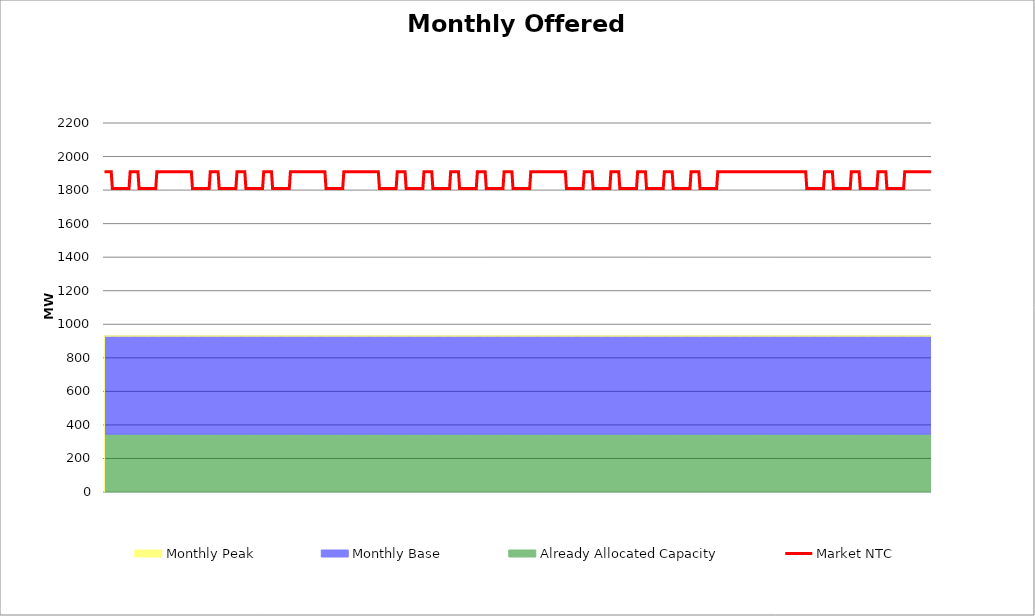
| Category | Market NTC |
|---|---|
| 0 | 1910 |
| 1 | 1910 |
| 2 | 1910 |
| 3 | 1910 |
| 4 | 1910 |
| 5 | 1910 |
| 6 | 1910 |
| 7 | 1810 |
| 8 | 1810 |
| 9 | 1810 |
| 10 | 1810 |
| 11 | 1810 |
| 12 | 1810 |
| 13 | 1810 |
| 14 | 1810 |
| 15 | 1810 |
| 16 | 1810 |
| 17 | 1810 |
| 18 | 1810 |
| 19 | 1810 |
| 20 | 1810 |
| 21 | 1810 |
| 22 | 1810 |
| 23 | 1910 |
| 24 | 1910 |
| 25 | 1910 |
| 26 | 1910 |
| 27 | 1910 |
| 28 | 1910 |
| 29 | 1910 |
| 30 | 1910 |
| 31 | 1810 |
| 32 | 1810 |
| 33 | 1810 |
| 34 | 1810 |
| 35 | 1810 |
| 36 | 1810 |
| 37 | 1810 |
| 38 | 1810 |
| 39 | 1810 |
| 40 | 1810 |
| 41 | 1810 |
| 42 | 1810 |
| 43 | 1810 |
| 44 | 1810 |
| 45 | 1810 |
| 46 | 1810 |
| 47 | 1910 |
| 48 | 1910 |
| 49 | 1910 |
| 50 | 1910 |
| 51 | 1910 |
| 52 | 1910 |
| 53 | 1910 |
| 54 | 1910 |
| 55 | 1910 |
| 56 | 1910 |
| 57 | 1910 |
| 58 | 1910 |
| 59 | 1910 |
| 60 | 1910 |
| 61 | 1910 |
| 62 | 1910 |
| 63 | 1910 |
| 64 | 1910 |
| 65 | 1910 |
| 66 | 1910 |
| 67 | 1910 |
| 68 | 1910 |
| 69 | 1910 |
| 70 | 1910 |
| 71 | 1910 |
| 72 | 1910 |
| 73 | 1910 |
| 74 | 1910 |
| 75 | 1910 |
| 76 | 1910 |
| 77 | 1910 |
| 78 | 1910 |
| 79 | 1810 |
| 80 | 1810 |
| 81 | 1810 |
| 82 | 1810 |
| 83 | 1810 |
| 84 | 1810 |
| 85 | 1810 |
| 86 | 1810 |
| 87 | 1810 |
| 88 | 1810 |
| 89 | 1810 |
| 90 | 1810 |
| 91 | 1810 |
| 92 | 1810 |
| 93 | 1810 |
| 94 | 1810 |
| 95 | 1910 |
| 96 | 1910 |
| 97 | 1910 |
| 98 | 1910 |
| 99 | 1910 |
| 100 | 1910 |
| 101 | 1910 |
| 102 | 1910 |
| 103 | 1810 |
| 104 | 1810 |
| 105 | 1810 |
| 106 | 1810 |
| 107 | 1810 |
| 108 | 1810 |
| 109 | 1810 |
| 110 | 1810 |
| 111 | 1810 |
| 112 | 1810 |
| 113 | 1810 |
| 114 | 1810 |
| 115 | 1810 |
| 116 | 1810 |
| 117 | 1810 |
| 118 | 1810 |
| 119 | 1910 |
| 120 | 1910 |
| 121 | 1910 |
| 122 | 1910 |
| 123 | 1910 |
| 124 | 1910 |
| 125 | 1910 |
| 126 | 1910 |
| 127 | 1810 |
| 128 | 1810 |
| 129 | 1810 |
| 130 | 1810 |
| 131 | 1810 |
| 132 | 1810 |
| 133 | 1810 |
| 134 | 1810 |
| 135 | 1810 |
| 136 | 1810 |
| 137 | 1810 |
| 138 | 1810 |
| 139 | 1810 |
| 140 | 1810 |
| 141 | 1810 |
| 142 | 1810 |
| 143 | 1910 |
| 144 | 1910 |
| 145 | 1910 |
| 146 | 1910 |
| 147 | 1910 |
| 148 | 1910 |
| 149 | 1910 |
| 150 | 1910 |
| 151 | 1810 |
| 152 | 1810 |
| 153 | 1810 |
| 154 | 1810 |
| 155 | 1810 |
| 156 | 1810 |
| 157 | 1810 |
| 158 | 1810 |
| 159 | 1810 |
| 160 | 1810 |
| 161 | 1810 |
| 162 | 1810 |
| 163 | 1810 |
| 164 | 1810 |
| 165 | 1810 |
| 166 | 1810 |
| 167 | 1910 |
| 168 | 1910 |
| 169 | 1910 |
| 170 | 1910 |
| 171 | 1910 |
| 172 | 1910 |
| 173 | 1910 |
| 174 | 1910 |
| 175 | 1910 |
| 176 | 1910 |
| 177 | 1910 |
| 178 | 1910 |
| 179 | 1910 |
| 180 | 1910 |
| 181 | 1910 |
| 182 | 1910 |
| 183 | 1910 |
| 184 | 1910 |
| 185 | 1910 |
| 186 | 1910 |
| 187 | 1910 |
| 188 | 1910 |
| 189 | 1910 |
| 190 | 1910 |
| 191 | 1910 |
| 192 | 1910 |
| 193 | 1910 |
| 194 | 1910 |
| 195 | 1910 |
| 196 | 1910 |
| 197 | 1910 |
| 198 | 1910 |
| 199 | 1810 |
| 200 | 1810 |
| 201 | 1810 |
| 202 | 1810 |
| 203 | 1810 |
| 204 | 1810 |
| 205 | 1810 |
| 206 | 1810 |
| 207 | 1810 |
| 208 | 1810 |
| 209 | 1810 |
| 210 | 1810 |
| 211 | 1810 |
| 212 | 1810 |
| 213 | 1810 |
| 214 | 1810 |
| 215 | 1910 |
| 216 | 1910 |
| 217 | 1910 |
| 218 | 1910 |
| 219 | 1910 |
| 220 | 1910 |
| 221 | 1910 |
| 222 | 1910 |
| 223 | 1910 |
| 224 | 1910 |
| 225 | 1910 |
| 226 | 1910 |
| 227 | 1910 |
| 228 | 1910 |
| 229 | 1910 |
| 230 | 1910 |
| 231 | 1910 |
| 232 | 1910 |
| 233 | 1910 |
| 234 | 1910 |
| 235 | 1910 |
| 236 | 1910 |
| 237 | 1910 |
| 238 | 1910 |
| 239 | 1910 |
| 240 | 1910 |
| 241 | 1910 |
| 242 | 1910 |
| 243 | 1910 |
| 244 | 1910 |
| 245 | 1910 |
| 246 | 1910 |
| 247 | 1810 |
| 248 | 1810 |
| 249 | 1810 |
| 250 | 1810 |
| 251 | 1810 |
| 252 | 1810 |
| 253 | 1810 |
| 254 | 1810 |
| 255 | 1810 |
| 256 | 1810 |
| 257 | 1810 |
| 258 | 1810 |
| 259 | 1810 |
| 260 | 1810 |
| 261 | 1810 |
| 262 | 1810 |
| 263 | 1910 |
| 264 | 1910 |
| 265 | 1910 |
| 266 | 1910 |
| 267 | 1910 |
| 268 | 1910 |
| 269 | 1910 |
| 270 | 1910 |
| 271 | 1810 |
| 272 | 1810 |
| 273 | 1810 |
| 274 | 1810 |
| 275 | 1810 |
| 276 | 1810 |
| 277 | 1810 |
| 278 | 1810 |
| 279 | 1810 |
| 280 | 1810 |
| 281 | 1810 |
| 282 | 1810 |
| 283 | 1810 |
| 284 | 1810 |
| 285 | 1810 |
| 286 | 1810 |
| 287 | 1910 |
| 288 | 1910 |
| 289 | 1910 |
| 290 | 1910 |
| 291 | 1910 |
| 292 | 1910 |
| 293 | 1910 |
| 294 | 1910 |
| 295 | 1810 |
| 296 | 1810 |
| 297 | 1810 |
| 298 | 1810 |
| 299 | 1810 |
| 300 | 1810 |
| 301 | 1810 |
| 302 | 1810 |
| 303 | 1810 |
| 304 | 1810 |
| 305 | 1810 |
| 306 | 1810 |
| 307 | 1810 |
| 308 | 1810 |
| 309 | 1810 |
| 310 | 1810 |
| 311 | 1910 |
| 312 | 1910 |
| 313 | 1910 |
| 314 | 1910 |
| 315 | 1910 |
| 316 | 1910 |
| 317 | 1910 |
| 318 | 1910 |
| 319 | 1810 |
| 320 | 1810 |
| 321 | 1810 |
| 322 | 1810 |
| 323 | 1810 |
| 324 | 1810 |
| 325 | 1810 |
| 326 | 1810 |
| 327 | 1810 |
| 328 | 1810 |
| 329 | 1810 |
| 330 | 1810 |
| 331 | 1810 |
| 332 | 1810 |
| 333 | 1810 |
| 334 | 1810 |
| 335 | 1910 |
| 336 | 1910 |
| 337 | 1910 |
| 338 | 1910 |
| 339 | 1910 |
| 340 | 1910 |
| 341 | 1910 |
| 342 | 1910 |
| 343 | 1810 |
| 344 | 1810 |
| 345 | 1810 |
| 346 | 1810 |
| 347 | 1810 |
| 348 | 1810 |
| 349 | 1810 |
| 350 | 1810 |
| 351 | 1810 |
| 352 | 1810 |
| 353 | 1810 |
| 354 | 1810 |
| 355 | 1810 |
| 356 | 1810 |
| 357 | 1810 |
| 358 | 1810 |
| 359 | 1910 |
| 360 | 1910 |
| 361 | 1910 |
| 362 | 1910 |
| 363 | 1910 |
| 364 | 1910 |
| 365 | 1910 |
| 366 | 1910 |
| 367 | 1810 |
| 368 | 1810 |
| 369 | 1810 |
| 370 | 1810 |
| 371 | 1810 |
| 372 | 1810 |
| 373 | 1810 |
| 374 | 1810 |
| 375 | 1810 |
| 376 | 1810 |
| 377 | 1810 |
| 378 | 1810 |
| 379 | 1810 |
| 380 | 1810 |
| 381 | 1810 |
| 382 | 1810 |
| 383 | 1910 |
| 384 | 1910 |
| 385 | 1910 |
| 386 | 1910 |
| 387 | 1910 |
| 388 | 1910 |
| 389 | 1910 |
| 390 | 1910 |
| 391 | 1910 |
| 392 | 1910 |
| 393 | 1910 |
| 394 | 1910 |
| 395 | 1910 |
| 396 | 1910 |
| 397 | 1910 |
| 398 | 1910 |
| 399 | 1910 |
| 400 | 1910 |
| 401 | 1910 |
| 402 | 1910 |
| 403 | 1910 |
| 404 | 1910 |
| 405 | 1910 |
| 406 | 1910 |
| 407 | 1910 |
| 408 | 1910 |
| 409 | 1910 |
| 410 | 1910 |
| 411 | 1910 |
| 412 | 1910 |
| 413 | 1910 |
| 414 | 1910 |
| 415 | 1810 |
| 416 | 1810 |
| 417 | 1810 |
| 418 | 1810 |
| 419 | 1810 |
| 420 | 1810 |
| 421 | 1810 |
| 422 | 1810 |
| 423 | 1810 |
| 424 | 1810 |
| 425 | 1810 |
| 426 | 1810 |
| 427 | 1810 |
| 428 | 1810 |
| 429 | 1810 |
| 430 | 1810 |
| 431 | 1910 |
| 432 | 1910 |
| 433 | 1910 |
| 434 | 1910 |
| 435 | 1910 |
| 436 | 1910 |
| 437 | 1910 |
| 438 | 1910 |
| 439 | 1810 |
| 440 | 1810 |
| 441 | 1810 |
| 442 | 1810 |
| 443 | 1810 |
| 444 | 1810 |
| 445 | 1810 |
| 446 | 1810 |
| 447 | 1810 |
| 448 | 1810 |
| 449 | 1810 |
| 450 | 1810 |
| 451 | 1810 |
| 452 | 1810 |
| 453 | 1810 |
| 454 | 1810 |
| 455 | 1910 |
| 456 | 1910 |
| 457 | 1910 |
| 458 | 1910 |
| 459 | 1910 |
| 460 | 1910 |
| 461 | 1910 |
| 462 | 1910 |
| 463 | 1810 |
| 464 | 1810 |
| 465 | 1810 |
| 466 | 1810 |
| 467 | 1810 |
| 468 | 1810 |
| 469 | 1810 |
| 470 | 1810 |
| 471 | 1810 |
| 472 | 1810 |
| 473 | 1810 |
| 474 | 1810 |
| 475 | 1810 |
| 476 | 1810 |
| 477 | 1810 |
| 478 | 1810 |
| 479 | 1910 |
| 480 | 1910 |
| 481 | 1910 |
| 482 | 1910 |
| 483 | 1910 |
| 484 | 1910 |
| 485 | 1910 |
| 486 | 1910 |
| 487 | 1810 |
| 488 | 1810 |
| 489 | 1810 |
| 490 | 1810 |
| 491 | 1810 |
| 492 | 1810 |
| 493 | 1810 |
| 494 | 1810 |
| 495 | 1810 |
| 496 | 1810 |
| 497 | 1810 |
| 498 | 1810 |
| 499 | 1810 |
| 500 | 1810 |
| 501 | 1810 |
| 502 | 1810 |
| 503 | 1910 |
| 504 | 1910 |
| 505 | 1910 |
| 506 | 1910 |
| 507 | 1910 |
| 508 | 1910 |
| 509 | 1910 |
| 510 | 1910 |
| 511 | 1810 |
| 512 | 1810 |
| 513 | 1810 |
| 514 | 1810 |
| 515 | 1810 |
| 516 | 1810 |
| 517 | 1810 |
| 518 | 1810 |
| 519 | 1810 |
| 520 | 1810 |
| 521 | 1810 |
| 522 | 1810 |
| 523 | 1810 |
| 524 | 1810 |
| 525 | 1810 |
| 526 | 1810 |
| 527 | 1910 |
| 528 | 1910 |
| 529 | 1910 |
| 530 | 1910 |
| 531 | 1910 |
| 532 | 1910 |
| 533 | 1910 |
| 534 | 1910 |
| 535 | 1810 |
| 536 | 1810 |
| 537 | 1810 |
| 538 | 1810 |
| 539 | 1810 |
| 540 | 1810 |
| 541 | 1810 |
| 542 | 1810 |
| 543 | 1810 |
| 544 | 1810 |
| 545 | 1810 |
| 546 | 1810 |
| 547 | 1810 |
| 548 | 1810 |
| 549 | 1810 |
| 550 | 1810 |
| 551 | 1910 |
| 552 | 1910 |
| 553 | 1910 |
| 554 | 1910 |
| 555 | 1910 |
| 556 | 1910 |
| 557 | 1910 |
| 558 | 1910 |
| 559 | 1910 |
| 560 | 1910 |
| 561 | 1910 |
| 562 | 1910 |
| 563 | 1910 |
| 564 | 1910 |
| 565 | 1910 |
| 566 | 1910 |
| 567 | 1910 |
| 568 | 1910 |
| 569 | 1910 |
| 570 | 1910 |
| 571 | 1910 |
| 572 | 1910 |
| 573 | 1910 |
| 574 | 1910 |
| 575 | 1910 |
| 576 | 1910 |
| 577 | 1910 |
| 578 | 1910 |
| 579 | 1910 |
| 580 | 1910 |
| 581 | 1910 |
| 582 | 1910 |
| 583 | 1910 |
| 584 | 1910 |
| 585 | 1910 |
| 586 | 1910 |
| 587 | 1910 |
| 588 | 1910 |
| 589 | 1910 |
| 590 | 1910 |
| 591 | 1910 |
| 592 | 1910 |
| 593 | 1910 |
| 594 | 1910 |
| 595 | 1910 |
| 596 | 1910 |
| 597 | 1910 |
| 598 | 1910 |
| 599 | 1910 |
| 600 | 1910 |
| 601 | 1910 |
| 602 | 1910 |
| 603 | 1910 |
| 604 | 1910 |
| 605 | 1910 |
| 606 | 1910 |
| 607 | 1910 |
| 608 | 1910 |
| 609 | 1910 |
| 610 | 1910 |
| 611 | 1910 |
| 612 | 1910 |
| 613 | 1910 |
| 614 | 1910 |
| 615 | 1910 |
| 616 | 1910 |
| 617 | 1910 |
| 618 | 1910 |
| 619 | 1910 |
| 620 | 1910 |
| 621 | 1910 |
| 622 | 1910 |
| 623 | 1910 |
| 624 | 1910 |
| 625 | 1910 |
| 626 | 1910 |
| 627 | 1910 |
| 628 | 1910 |
| 629 | 1910 |
| 630 | 1910 |
| 631 | 1810 |
| 632 | 1810 |
| 633 | 1810 |
| 634 | 1810 |
| 635 | 1810 |
| 636 | 1810 |
| 637 | 1810 |
| 638 | 1810 |
| 639 | 1810 |
| 640 | 1810 |
| 641 | 1810 |
| 642 | 1810 |
| 643 | 1810 |
| 644 | 1810 |
| 645 | 1810 |
| 646 | 1810 |
| 647 | 1910 |
| 648 | 1910 |
| 649 | 1910 |
| 650 | 1910 |
| 651 | 1910 |
| 652 | 1910 |
| 653 | 1910 |
| 654 | 1910 |
| 655 | 1810 |
| 656 | 1810 |
| 657 | 1810 |
| 658 | 1810 |
| 659 | 1810 |
| 660 | 1810 |
| 661 | 1810 |
| 662 | 1810 |
| 663 | 1810 |
| 664 | 1810 |
| 665 | 1810 |
| 666 | 1810 |
| 667 | 1810 |
| 668 | 1810 |
| 669 | 1810 |
| 670 | 1810 |
| 671 | 1910 |
| 672 | 1910 |
| 673 | 1910 |
| 674 | 1910 |
| 675 | 1910 |
| 676 | 1910 |
| 677 | 1910 |
| 678 | 1910 |
| 679 | 1810 |
| 680 | 1810 |
| 681 | 1810 |
| 682 | 1810 |
| 683 | 1810 |
| 684 | 1810 |
| 685 | 1810 |
| 686 | 1810 |
| 687 | 1810 |
| 688 | 1810 |
| 689 | 1810 |
| 690 | 1810 |
| 691 | 1810 |
| 692 | 1810 |
| 693 | 1810 |
| 694 | 1810 |
| 695 | 1910 |
| 696 | 1910 |
| 697 | 1910 |
| 698 | 1910 |
| 699 | 1910 |
| 700 | 1910 |
| 701 | 1910 |
| 702 | 1910 |
| 703 | 1810 |
| 704 | 1810 |
| 705 | 1810 |
| 706 | 1810 |
| 707 | 1810 |
| 708 | 1810 |
| 709 | 1810 |
| 710 | 1810 |
| 711 | 1810 |
| 712 | 1810 |
| 713 | 1810 |
| 714 | 1810 |
| 715 | 1810 |
| 716 | 1810 |
| 717 | 1810 |
| 718 | 1810 |
| 719 | 1910 |
| 720 | 1910 |
| 721 | 1910 |
| 722 | 1910 |
| 723 | 1910 |
| 724 | 1910 |
| 725 | 1910 |
| 726 | 1910 |
| 727 | 1910 |
| 728 | 1910 |
| 729 | 1910 |
| 730 | 1910 |
| 731 | 1910 |
| 732 | 1910 |
| 733 | 1910 |
| 734 | 1910 |
| 735 | 1910 |
| 736 | 1910 |
| 737 | 1910 |
| 738 | 1910 |
| 739 | 1910 |
| 740 | 1910 |
| 741 | 1910 |
| 742 | 1910 |
| 743 | 1910 |